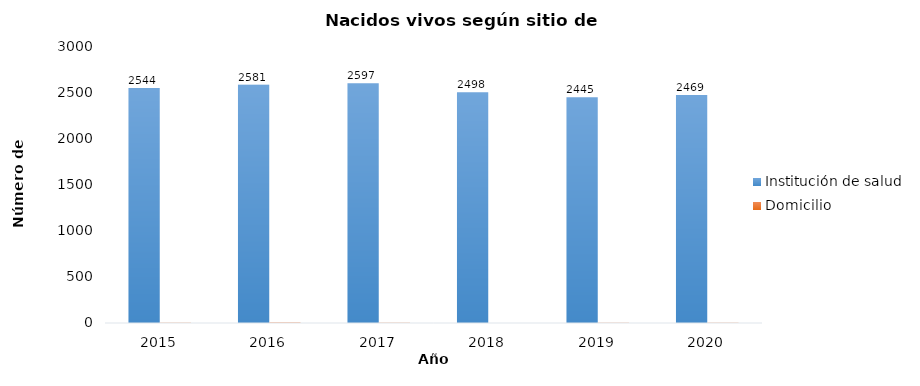
| Category | Institución de salud | Domicilio |
|---|---|---|
| 2015.0 | 2544 | 4 |
| 2016.0 | 2581 | 6 |
| 2017.0 | 2597 | 4 |
| 2018.0 | 2498 | 0 |
| 2019.0 | 2445 | 3 |
| 2020.0 | 2469 | 3 |